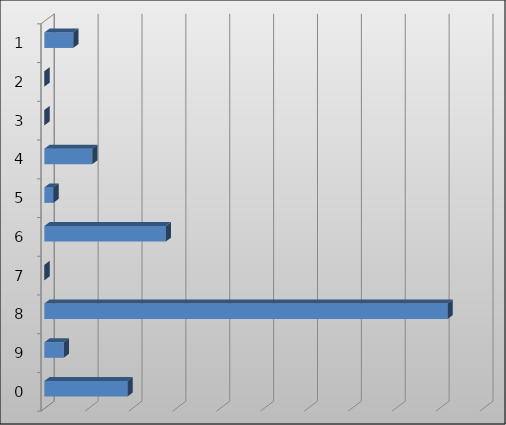
| Category | Series 0 |
|---|---|
| 1.0 | 3290346 |
| 2.0 | 0 |
| 3.0 | 0 |
| 4.0 | 5464429 |
| 5.0 | 1024554 |
| 6.0 | 13840087 |
| 7.0 | 0 |
| 8.0 | 45939410 |
| 9.0 | 2204275 |
| 0.0 | 9480000 |